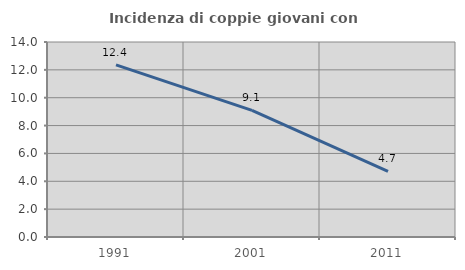
| Category | Incidenza di coppie giovani con figli |
|---|---|
| 1991.0 | 12.36 |
| 2001.0 | 9.091 |
| 2011.0 | 4.717 |